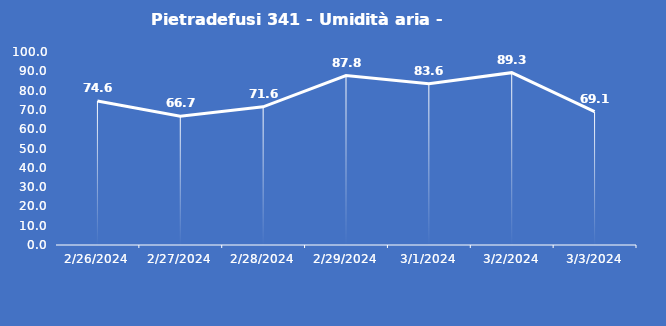
| Category | Pietradefusi 341 - Umidità aria - Grezzo (%) |
|---|---|
| 2/26/24 | 74.6 |
| 2/27/24 | 66.7 |
| 2/28/24 | 71.6 |
| 2/29/24 | 87.8 |
| 3/1/24 | 83.6 |
| 3/2/24 | 89.3 |
| 3/3/24 | 69.1 |